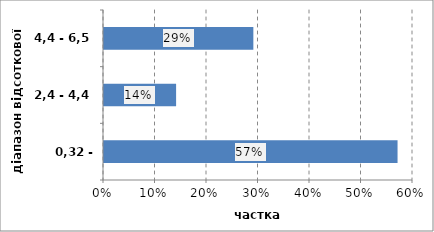
| Category | Series 0 |
|---|---|
| 0,32 - 2,4 | 0.57 |
| 2,4 - 4,4 | 0.14 |
| 4,4 - 6,5 | 0.29 |